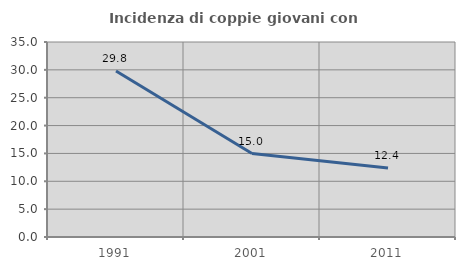
| Category | Incidenza di coppie giovani con figli |
|---|---|
| 1991.0 | 29.794 |
| 2001.0 | 14.986 |
| 2011.0 | 12.399 |